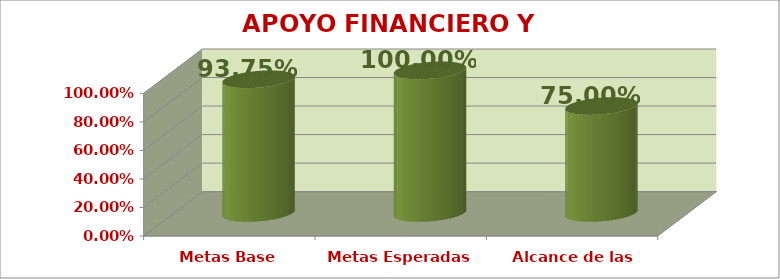
| Category | APOYO FINANCIERO Y CONTABLE |
|---|---|
| Metas Base | 0.938 |
| Metas Esperadas | 1 |
| Alcance de las Metas | 0.75 |